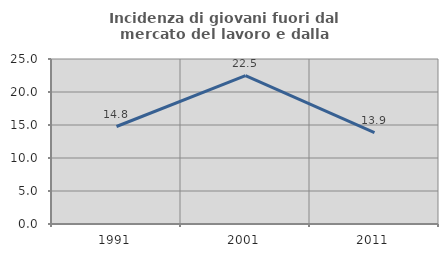
| Category | Incidenza di giovani fuori dal mercato del lavoro e dalla formazione  |
|---|---|
| 1991.0 | 14.77 |
| 2001.0 | 22.489 |
| 2011.0 | 13.855 |